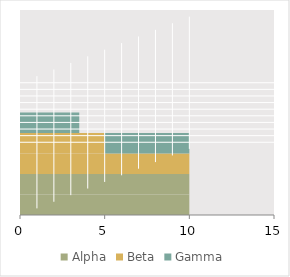
| Category | Alpha | Beta | Gamma |
|---|---|---|---|
| 0 | 10 | 0 | 0 |
| 1 | 10 | 0 | 0 |
| 2 | 0 | 10 | 0 |
| 3 | 0 | 5 | 5 |
| 4 | 0 | 0 | 3.5 |
| 5 | 0 | 0 | 0 |
| 6 | 0 | 0 | 0 |
| 7 | 0 | 0 | 0 |
| 8 | 0 | 0 | 0 |
| 9 | 0 | 0 | 0 |